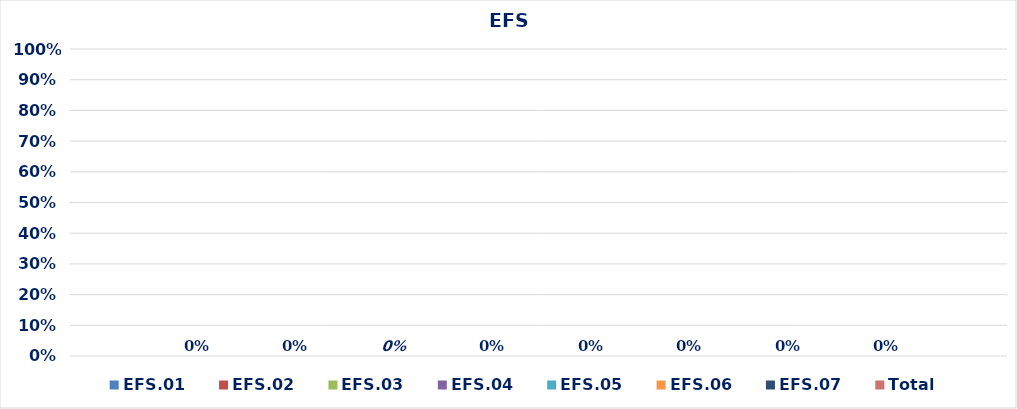
| Category | EFS.01 | EFS.02 | EFS.03 | EFS.04 | EFS.05 | EFS.06 | EFS.07 | Total |
|---|---|---|---|---|---|---|---|---|
| 0 | 0 | 0 | 0 | 0 | 0 | 0 | 0 | 0 |